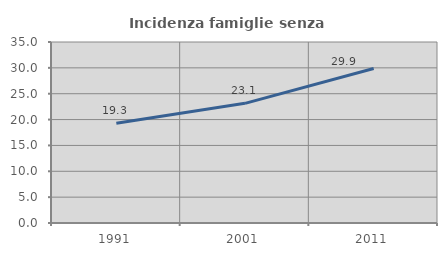
| Category | Incidenza famiglie senza nuclei |
|---|---|
| 1991.0 | 19.295 |
| 2001.0 | 23.141 |
| 2011.0 | 29.88 |